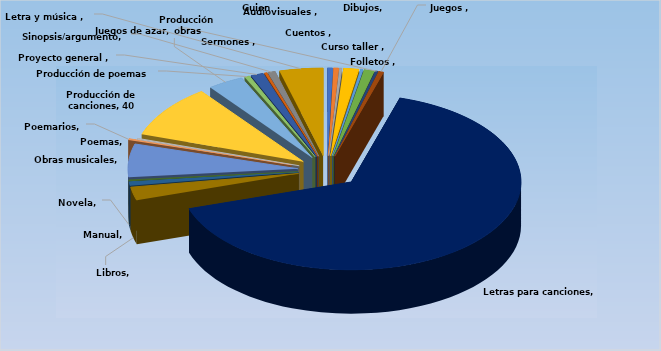
| Category | Cantidad |
|---|---|
| Audiovisuales  | 2 |
| Cuentos  | 2 |
| Curso taller  | 1 |
| Dibujos | 6 |
| Folletos  | 1 |
| Guion cinematográfico | 4 |
| Juegos de azar | 1 |
| Juegos  | 2 |
| Letras para canciones | 269 |
| Libros | 10 |
| Manual | 3 |
| Novela | 1 |
| Obras musicales | 25 |
| Poemarios | 1 |
| Poemas | 1 |
| Producción de canciones | 40 |
| Producción obras musicales | 14 |
| Producción de poemas  | 2 |
| Proyecto general  | 5 |
| Sermones  | 1 |
| Sinopsis/argumento | 3 |
| Letra y música  | 17 |